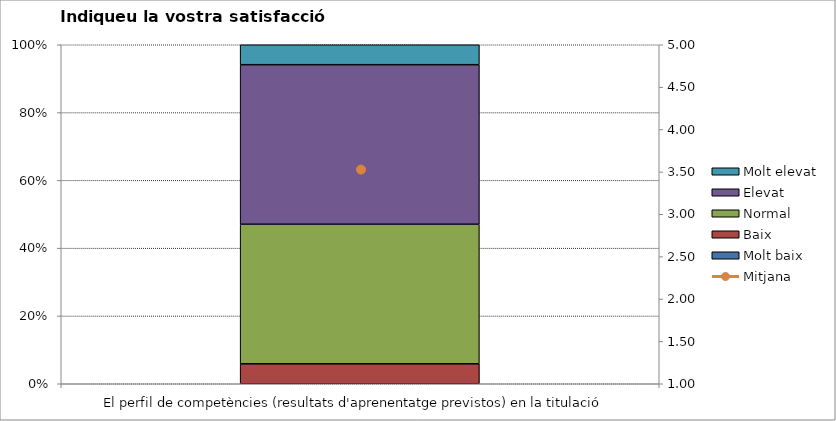
| Category | Molt baix | Baix | Normal  | Elevat | Molt elevat |
|---|---|---|---|---|---|
| El perfil de competències (resultats d'aprenentatge previstos) en la titulació | 0 | 1 | 7 | 8 | 1 |